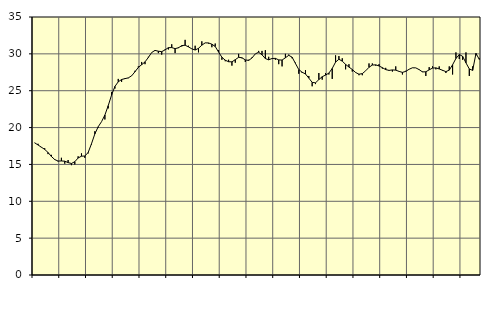
| Category | Piggar | Series 1 |
|---|---|---|
| nan | 17.9 | 17.93 |
| 87.0 | 17.8 | 17.64 |
| 87.0 | 17.3 | 17.34 |
| 87.0 | 17.2 | 17.04 |
| nan | 16.4 | 16.62 |
| 88.0 | 16.3 | 16.08 |
| 88.0 | 15.6 | 15.66 |
| 88.0 | 15.4 | 15.46 |
| nan | 15.9 | 15.47 |
| 89.0 | 15.1 | 15.44 |
| 89.0 | 15.6 | 15.25 |
| 89.0 | 14.9 | 15.13 |
| nan | 15 | 15.37 |
| 90.0 | 16.1 | 15.87 |
| 90.0 | 16.5 | 16.12 |
| 90.0 | 15.9 | 16.14 |
| nan | 16.5 | 16.62 |
| 91.0 | 17.7 | 17.81 |
| 91.0 | 19.5 | 19.14 |
| 91.0 | 20 | 20.11 |
| nan | 20.8 | 20.8 |
| 92.0 | 21.1 | 21.7 |
| 92.0 | 22.6 | 22.97 |
| 92.0 | 24.8 | 24.41 |
| nan | 25.3 | 25.58 |
| 93.0 | 26.6 | 26.21 |
| 93.0 | 26.2 | 26.52 |
| 93.0 | 26.7 | 26.64 |
| nan | 26.7 | 26.74 |
| 94.0 | 27 | 27.02 |
| 94.0 | 27.7 | 27.57 |
| 94.0 | 28.3 | 28.16 |
| nan | 28.9 | 28.53 |
| 95.0 | 28.6 | 28.91 |
| 95.0 | 29.6 | 29.51 |
| 95.0 | 30.2 | 30.18 |
| nan | 30.4 | 30.47 |
| 96.0 | 30.1 | 30.36 |
| 96.0 | 29.9 | 30.3 |
| 96.0 | 30.6 | 30.54 |
| nan | 30.6 | 30.84 |
| 97.0 | 31.3 | 30.85 |
| 97.0 | 30.1 | 30.71 |
| 97.0 | 30.9 | 30.82 |
| nan | 31 | 31.12 |
| 98.0 | 31.9 | 31.17 |
| 98.0 | 31.1 | 30.95 |
| 98.0 | 30.7 | 30.68 |
| nan | 31.1 | 30.52 |
| 99.0 | 30.2 | 30.75 |
| 99.0 | 31.7 | 31.18 |
| 99.0 | 31.5 | 31.49 |
| nan | 31.4 | 31.48 |
| 0.0 | 30.9 | 31.31 |
| 0.0 | 31.4 | 31 |
| 0.0 | 30.5 | 30.25 |
| nan | 29.2 | 29.54 |
| 1.0 | 29 | 29.14 |
| 1.0 | 29.2 | 28.93 |
| 1.0 | 28.4 | 28.92 |
| nan | 28.8 | 29.21 |
| 2.0 | 30 | 29.53 |
| 2.0 | 29.4 | 29.47 |
| 2.0 | 28.9 | 29.18 |
| nan | 29.2 | 29.11 |
| 3.0 | 29.5 | 29.44 |
| 3.0 | 30 | 30 |
| 3.0 | 30.4 | 30.22 |
| nan | 30.4 | 29.87 |
| 4.0 | 30.5 | 29.36 |
| 4.0 | 29.6 | 29.19 |
| 4.0 | 29.4 | 29.37 |
| nan | 29.2 | 29.39 |
| 5.0 | 28.6 | 29.18 |
| 5.0 | 28.3 | 29.16 |
| 5.0 | 30 | 29.47 |
| nan | 29.9 | 29.8 |
| 6.0 | 29.4 | 29.55 |
| 6.0 | 28.8 | 28.7 |
| 6.0 | 27.3 | 27.87 |
| nan | 27.4 | 27.51 |
| 7.0 | 27.8 | 27.27 |
| 7.0 | 27 | 26.71 |
| 7.0 | 25.6 | 26.13 |
| nan | 25.9 | 26.07 |
| 8.0 | 27.4 | 26.51 |
| 8.0 | 26.5 | 26.9 |
| 8.0 | 27.4 | 27.12 |
| nan | 27.2 | 27.39 |
| 9.0 | 26.6 | 28.02 |
| 9.0 | 29.8 | 28.88 |
| 9.0 | 29.7 | 29.27 |
| nan | 29.4 | 29.01 |
| 10.0 | 27.9 | 28.57 |
| 10.0 | 28.6 | 28.21 |
| 10.0 | 27.6 | 27.88 |
| nan | 27.5 | 27.47 |
| 11.0 | 27.1 | 27.24 |
| 11.0 | 27.1 | 27.32 |
| 11.0 | 27.7 | 27.7 |
| nan | 28.7 | 28.18 |
| 12.0 | 28.7 | 28.48 |
| 12.0 | 28.4 | 28.51 |
| 12.0 | 28.6 | 28.36 |
| nan | 28 | 28.13 |
| 13.0 | 28.1 | 27.86 |
| 13.0 | 27.7 | 27.76 |
| 13.0 | 27.6 | 27.82 |
| nan | 28.3 | 27.79 |
| 14.0 | 27.6 | 27.62 |
| 14.0 | 27.2 | 27.49 |
| 14.0 | 27.7 | 27.62 |
| nan | 27.9 | 27.91 |
| 15.0 | 28.1 | 28.11 |
| 15.0 | 28.1 | 28.1 |
| 15.0 | 27.9 | 27.86 |
| nan | 27.6 | 27.55 |
| 16.0 | 27 | 27.57 |
| 16.0 | 28.2 | 27.83 |
| 16.0 | 28.3 | 28.07 |
| nan | 27.9 | 28.1 |
| 17.0 | 28.3 | 27.95 |
| 17.0 | 27.7 | 27.77 |
| 17.0 | 27.4 | 27.59 |
| nan | 28.3 | 27.79 |
| 18.0 | 27.2 | 28.52 |
| 18.0 | 30.2 | 29.37 |
| 18.0 | 29.3 | 29.91 |
| nan | 29.2 | 29.67 |
| 19.0 | 30.2 | 28.78 |
| 19.0 | 27 | 27.95 |
| 19.0 | 28.3 | 27.76 |
| nan | 29.8 | 30.06 |
| 20.0 | 29.4 | 29.24 |